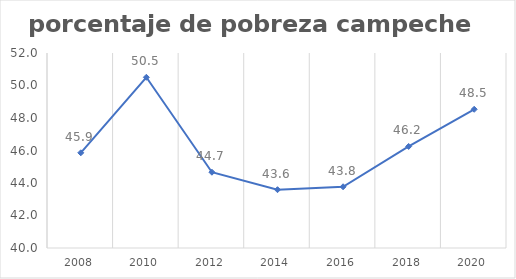
| Category | Series 0 |
|---|---|
| 2008.0 | 45.858 |
| 2010.0 | 50.505 |
| 2012.0 | 44.664 |
| 2014.0 | 43.588 |
| 2016.0 | 43.768 |
| 2018.0 | 46.249 |
| 2020.0 | 48.537 |